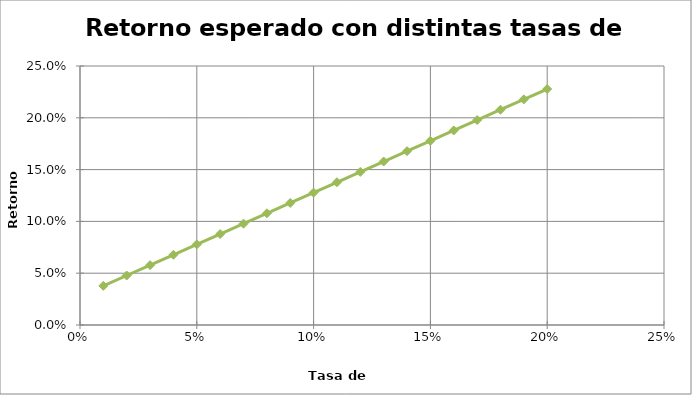
| Category | Series 0 |
|---|---|
| 0.01 | 0.038 |
| 0.02 | 0.048 |
| 0.03 | 0.058 |
| 0.04 | 0.068 |
| 0.05 | 0.078 |
| 0.06 | 0.088 |
| 0.07 | 0.098 |
| 0.08 | 0.108 |
| 0.09 | 0.118 |
| 0.1 | 0.128 |
| 0.11 | 0.138 |
| 0.12 | 0.148 |
| 0.13 | 0.158 |
| 0.14 | 0.168 |
| 0.15 | 0.178 |
| 0.16 | 0.188 |
| 0.17 | 0.198 |
| 0.18 | 0.208 |
| 0.19 | 0.218 |
| 0.2 | 0.228 |